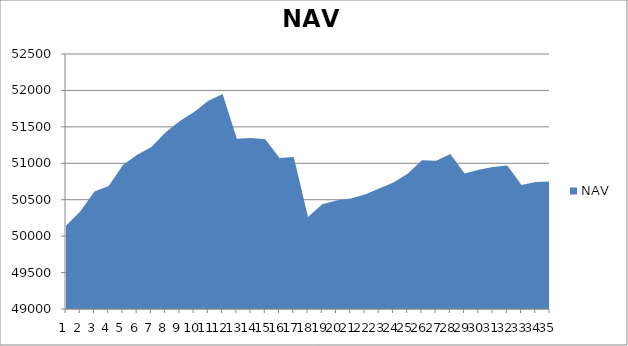
| Category | NAV |
|---|---|
| 0 | 50142.343 |
| 1 | 50336.57 |
| 2 | 50612.255 |
| 3 | 50687.913 |
| 4 | 50975.413 |
| 5 | 51115.874 |
| 6 | 51223.542 |
| 7 | 51427.364 |
| 8 | 51580.567 |
| 9 | 51704.692 |
| 10 | 51858.016 |
| 11 | 51951.766 |
| 12 | 51336.067 |
| 13 | 51345.356 |
| 14 | 51328.667 |
| 15 | 51072.985 |
| 16 | 51085.199 |
| 17 | 50261.67 |
| 18 | 50438.394 |
| 19 | 50489.896 |
| 20 | 50518.251 |
| 21 | 50572.468 |
| 22 | 50655.55 |
| 23 | 50737.787 |
| 24 | 50856.035 |
| 25 | 51041.806 |
| 26 | 51034.925 |
| 27 | 51128.589 |
| 28 | 50859.456 |
| 29 | 50911.137 |
| 30 | 50950.007 |
| 31 | 50970.175 |
| 32 | 50701.326 |
| 33 | 50743.495 |
| 34 | 50751.546 |